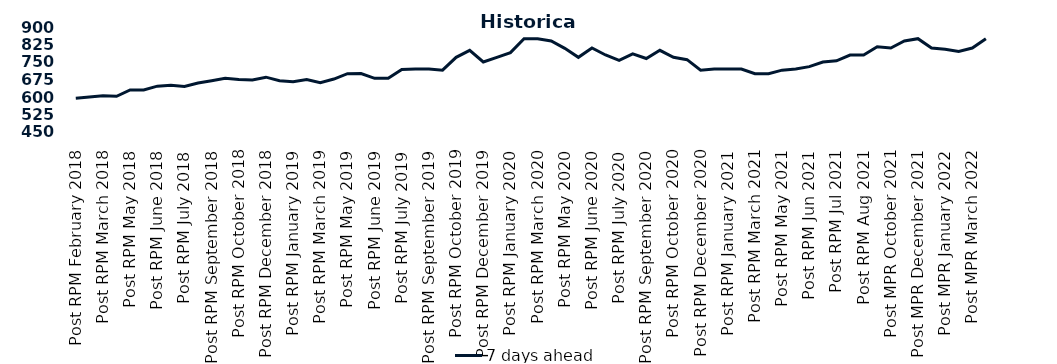
| Category | 7 days ahead |
|---|---|
| Post RPM February 2018 | 595 |
| Pre RPM March 2018 | 600 |
| Post RPM March 2018 | 605 |
| Pre RPM May 2018 | 603 |
| Post RPM May 2018 | 630 |
| Pre RPM June 2018 | 630 |
| Post RPM June 2018 | 646.5 |
| Pre RPM July 2018 | 650 |
| Post RPM July 2018 | 645 |
| Pre RPM September 2018 | 660 |
| Post RPM September 2018 | 670 |
| Pre RPM October 2018 | 680 |
| Post RPM October 2018 | 675 |
| Pre RPM December 2018 | 672.5 |
| Post RPM December 2018 | 685 |
| Pre RPM January 2019 | 670 |
| Post RPM January 2019 | 665 |
| Pre RPM March 2019 | 675 |
| Post RPM March 2019 | 661 |
| Pre RPM May 2019 | 677 |
| Post RPM May 2019 | 700 |
| Pre RPM June 2019 | 700.5 |
| Post RPM June 2019 | 680 |
| Pre RPM July 2019 | 680 |
| Post RPM July 2019 | 717.5 |
| Pre RPM September 2019 | 720 |
| Post RPM September 2019 | 720 |
| Pre RPM October 2019 | 715 |
| Post RPM October 2019 | 770 |
| Pre RPM December 2019 | 800 |
| Post RPM December 2019 | 750 |
| Pre RPM January 2020 | 770 |
| Post RPM January 2020 | 790 |
| Pre RPM March 2020 | 850 |
| Post RPM March 2020 | 850 |
| Pre RPM May 2020 | 840 |
| Post RPM May 2020 | 808.5 |
| Pre RPM June 2020 | 770 |
| Post RPM June 2020 | 810 |
| Pre RPM July 2020 | 780 |
| Post RPM July 2020 | 757 |
| Pre RPM September 2020 | 785 |
| Post RPM September 2020 | 765 |
| Pre RPM October 2020 | 800 |
| Post RPM October 2020 | 770 |
| Pre RPM December 2020 | 760 |
|  Post RPM December 2020 | 715 |
| Pre RPM January 2021 | 720 |
| Post RPM January 2021 | 720 |
|  Pre RPM March 2021 | 720 |
|  Post RPM March 2021 | 700 |
|  Pre RPM May 2021 | 700 |
|  Post RPM May 2021 | 715 |
|  Pre RPM Jun 2021 | 720 |
|   Post RPM Jun 2021 | 730 |
| Pre RPM Jul 2021 | 750 |
|  Post RPM Jul 2021 | 755 |
| Pre RPM Aug 2021 | 780 |
|  Post RPM Aug 2021 | 780 |
| Pre MPR October 2021 | 815 |
| Post MPR October 2021 | 810 |
| Pre MPR December 2021 | 840 |
| Post MPR December 2021 | 850 |
| Pre MPR January 2022 | 810 |
| Post MPR January 2022 | 805 |
| Pre MPR March 2022 | 795 |
| Post MPR March 2022 | 810 |
| Pre MPR May 2022 | 850 |